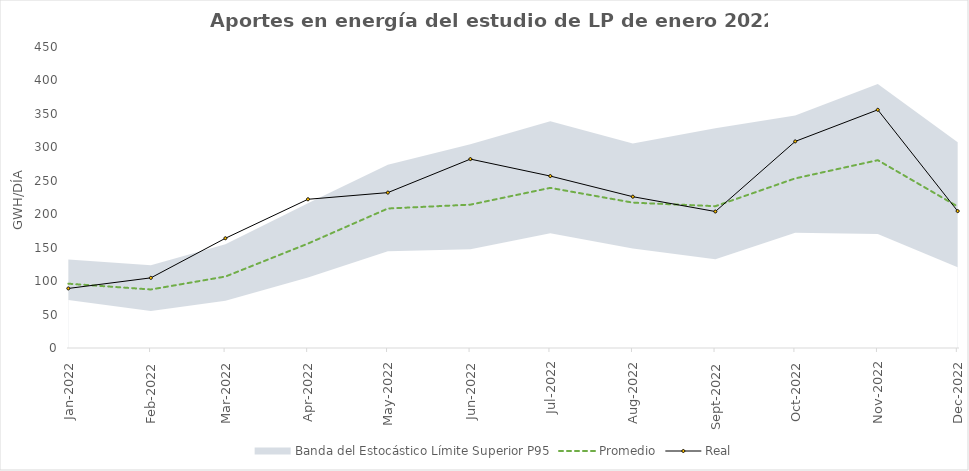
| Category | Promedio | Real |
|---|---|---|
| 2022-01-01 | 96.141 | 89.034 |
| 2022-02-01 | 87.483 | 104.863 |
| 2022-03-01 | 106.83 | 164.076 |
| 2022-04-01 | 156.121 | 222.359 |
| 2022-05-01 | 208.529 | 232.308 |
| 2022-06-01 | 214.315 | 282.403 |
| 2022-07-01 | 239.386 | 257.064 |
| 2022-08-01 | 217.331 | 226.211 |
| 2022-09-01 | 212.012 | 204.041 |
| 2022-10-01 | 253.59 | 308.871 |
| 2022-11-01 | 280.783 | 356.074 |
| 2022-12-01 | 211.547 | 204.669 |